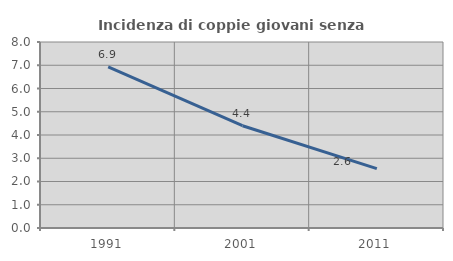
| Category | Incidenza di coppie giovani senza figli |
|---|---|
| 1991.0 | 6.926 |
| 2001.0 | 4.4 |
| 2011.0 | 2.555 |